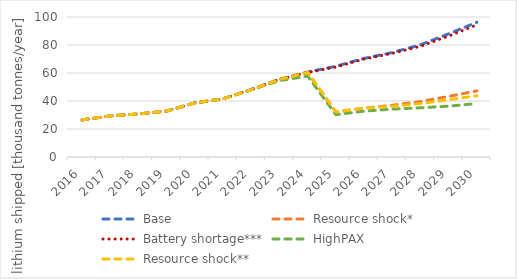
| Category | Base | Resource shock* | Battery shortage*** | HighPAX | Resource shock** |
|---|---|---|---|---|---|
| 2016.0 | 26523.3 | 26523.3 | 26523.3 | 26523.3 | 26523.3 |
| 2017.0 | 29362.1 | 29362.1 | 29362.1 | 29362.1 | 29362.1 |
| 2018.0 | 30725.9 | 30725.9 | 30725.9 | 30725.9 | 30725.9 |
| 2019.0 | 32811.8 | 32811.8 | 32811.8 | 32811.8 | 32811.8 |
| 2020.0 | 38655.8 | 38655.8 | 38655.8 | 38655.8 | 38655.8 |
| 2021.0 | 41586.1 | 41552.5 | 41586.1 | 41552.5 | 41552.5 |
| 2022.0 | 48176.1 | 48092.1 | 48176.1 | 48092.1 | 48092.1 |
| 2023.0 | 55550.3 | 55388.7 | 55414.6 | 54574.5 | 55388.7 |
| 2024.0 | 60715.1 | 60366.7 | 60366.9 | 57738.7 | 60366.7 |
| 2025.0 | 64811.4 | 32151.2 | 64302.9 | 30258.3 | 32151.2 |
| 2026.0 | 70416.8 | 34932.7 | 69993.6 | 32747.2 | 34932.7 |
| 2027.0 | 74618.3 | 36952.5 | 74017.8 | 34205.4 | 36232.1 |
| 2028.0 | 80158.5 | 39564.5 | 79117.6 | 35136.5 | 38169.4 |
| 2029.0 | 87978.3 | 43275.4 | 86430.3 | 36324.4 | 40936.8 |
| 2030.0 | 96228.7 | 47233.6 | 94363.8 | 38158.1 | 43745.9 |